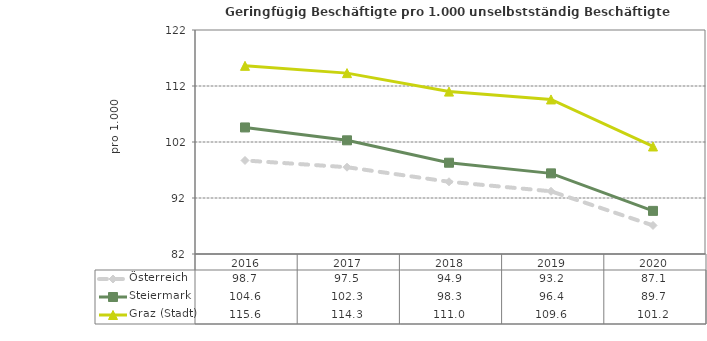
| Category | Österreich | Steiermark | Graz (Stadt) |
|---|---|---|---|
| 2020.0 | 87.1 | 89.7 | 101.2 |
| 2019.0 | 93.2 | 96.4 | 109.6 |
| 2018.0 | 94.9 | 98.3 | 111 |
| 2017.0 | 97.5 | 102.3 | 114.3 |
| 2016.0 | 98.7 | 104.6 | 115.6 |